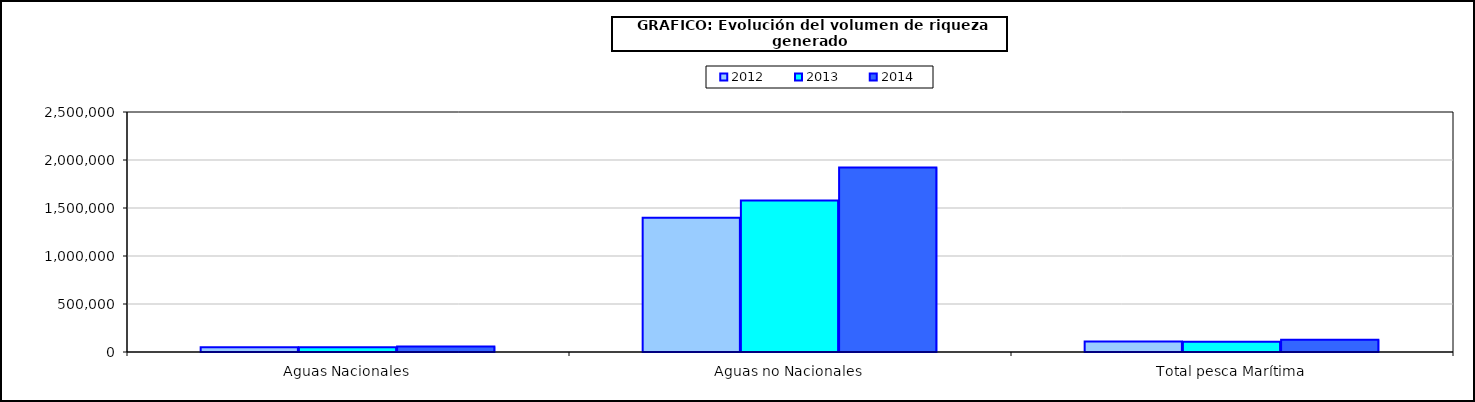
| Category | 2012 | 2013 | 2014 |
|---|---|---|---|
| 0 | 48903.823 | 49553.023 | 58006.819 |
| 1 | 1399085.139 | 1578467.456 | 1922670.538 |
| 2 | 108733.18 | 107603.704 | 127271.635 |